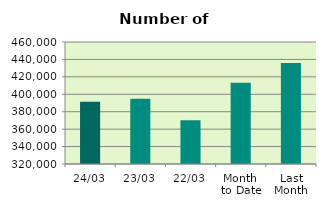
| Category | Series 0 |
|---|---|
| 24/03 | 391560 |
| 23/03 | 394928 |
| 22/03 | 370272 |
| Month 
to Date | 413122.222 |
| Last
Month | 435925.8 |